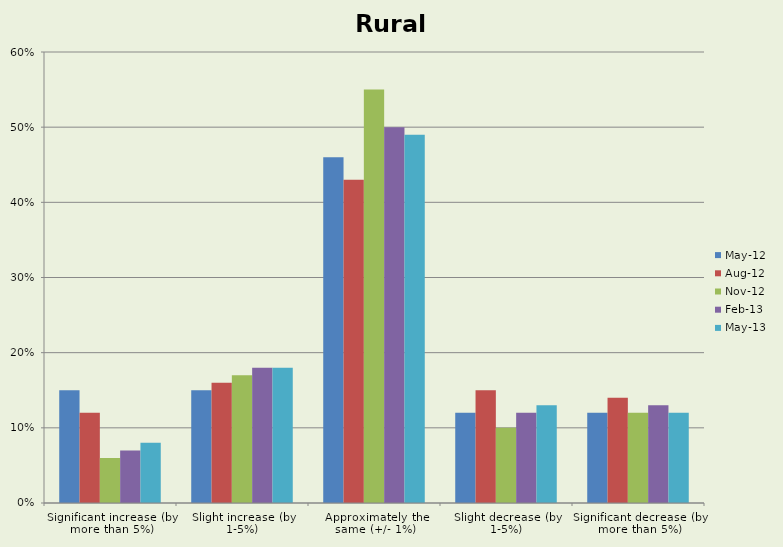
| Category | May-12 | Aug-12 | Nov-12 | Feb-13 | May-13 |
|---|---|---|---|---|---|
| Significant increase (by more than 5%) | 0.15 | 0.12 | 0.06 | 0.07 | 0.08 |
| Slight increase (by 1-5%) | 0.15 | 0.16 | 0.17 | 0.18 | 0.18 |
| Approximately the same (+/- 1%) | 0.46 | 0.43 | 0.55 | 0.5 | 0.49 |
| Slight decrease (by 1-5%) | 0.12 | 0.15 | 0.1 | 0.12 | 0.13 |
| Significant decrease (by more than 5%) | 0.12 | 0.14 | 0.12 | 0.13 | 0.12 |